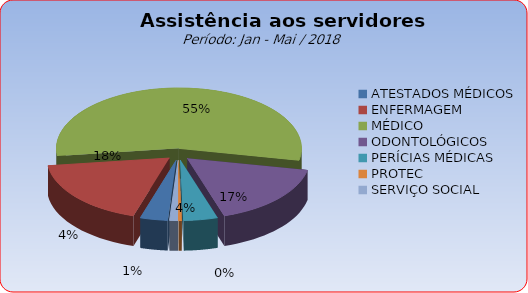
| Category | Series 0 |
|---|---|
| ATESTADOS MÉDICOS | 3.636 |
| ENFERMAGEM | 18.224 |
| MÉDICO | 55.18 |
| ODONTOLÓGICOS | 16.956 |
| PERÍCIAS MÉDICAS | 4.482 |
| PROTEC | 0.423 |
| SERVIÇO SOCIAL | 1.099 |